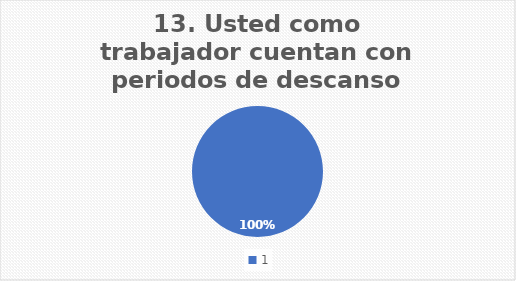
| Category | Usted como trabajador cuentan con periodos de descanso suficientes? |
|---|---|
| 0 | 100 |